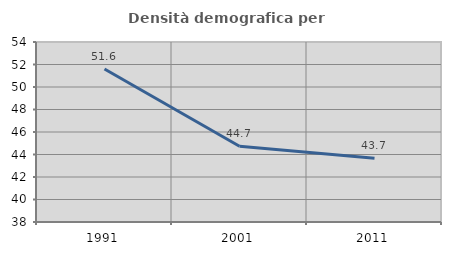
| Category | Densità demografica |
|---|---|
| 1991.0 | 51.598 |
| 2001.0 | 44.738 |
| 2011.0 | 43.657 |